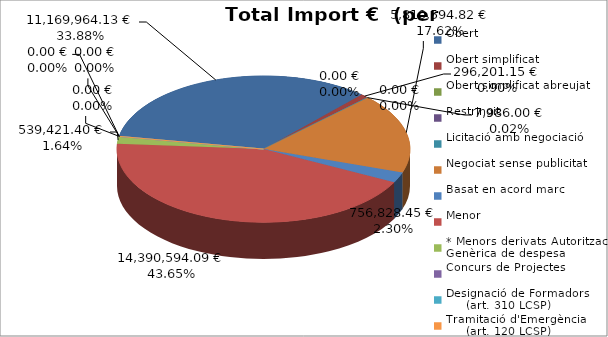
| Category | Total preu
(amb IVA) |
|---|---|
| Obert | 11169964.13 |
| Obert simplificat | 296201.15 |
| Obert simplificat abreujat | 7986 |
| Restringit | 0 |
| Licitació amb negociació | 0 |
| Negociat sense publicitat | 5810594.82 |
| Basat en acord marc | 756828.45 |
| Menor | 14390594.09 |
| * Menors derivats Autorització Genèrica de despesa | 539421.4 |
| Concurs de Projectes | 0 |
| Designació de Formadors
     (art. 310 LCSP) | 0 |
| Tramitació d'Emergència
     (art. 120 LCSP) | 0 |